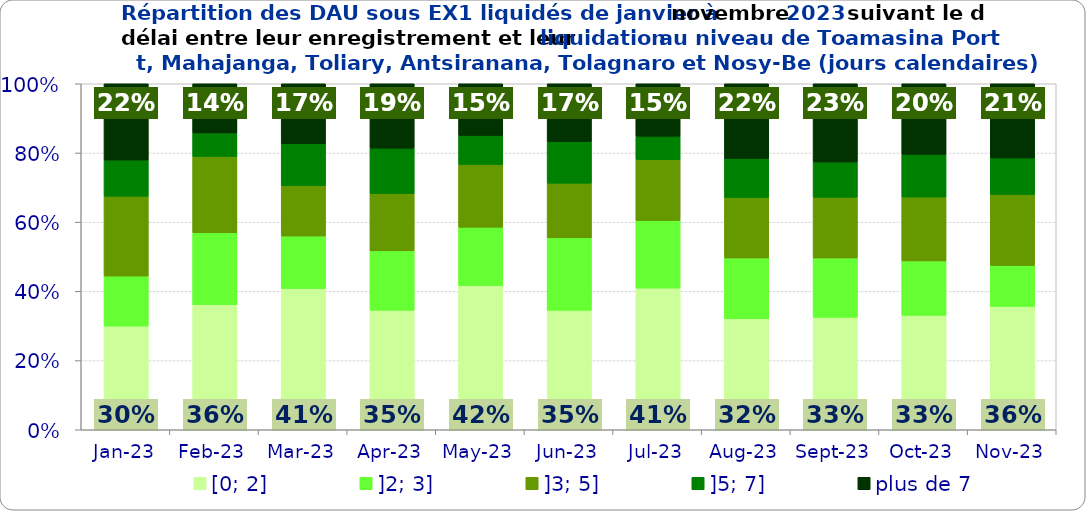
| Category | [0; 2] | ]2; 3] | ]3; 5] | ]5; 7] | plus de 7 |
|---|---|---|---|---|---|
| 2023-01-01 | 0.3 | 0.145 | 0.231 | 0.104 | 0.221 |
| 2023-02-01 | 0.362 | 0.208 | 0.221 | 0.068 | 0.142 |
| 2023-03-01 | 0.408 | 0.152 | 0.146 | 0.121 | 0.173 |
| 2023-04-01 | 0.345 | 0.172 | 0.165 | 0.131 | 0.186 |
| 2023-05-01 | 0.417 | 0.169 | 0.181 | 0.084 | 0.149 |
| 2023-06-01 | 0.345 | 0.209 | 0.158 | 0.12 | 0.167 |
| 2023-07-01 | 0.409 | 0.195 | 0.176 | 0.068 | 0.152 |
| 2023-08-01 | 0.321 | 0.176 | 0.175 | 0.113 | 0.216 |
| 2023-09-01 | 0.325 | 0.171 | 0.175 | 0.102 | 0.226 |
| 2023-10-01 | 0.331 | 0.157 | 0.184 | 0.123 | 0.204 |
| 2023-11-01 | 0.357 | 0.118 | 0.205 | 0.105 | 0.215 |